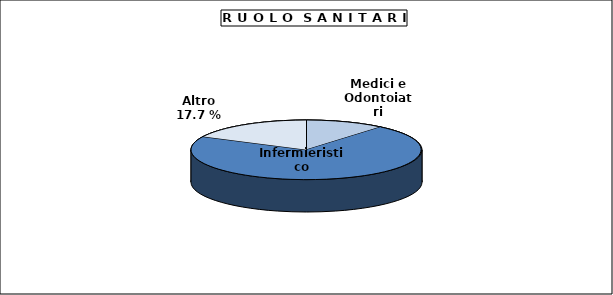
| Category | Personale altri ruoli |
|---|---|
| Medici e Odontoiatri | 108 |
| Infermieristico | 692 |
| Altro | 172 |